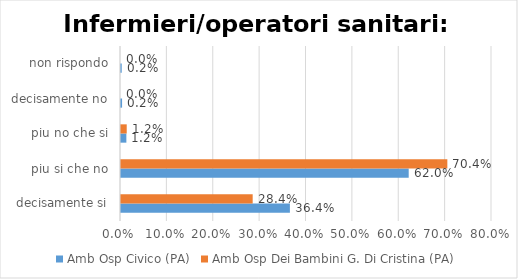
| Category | Amb Osp Civico (PA) | Amb Osp Dei Bambini G. Di Cristina (PA) |
|---|---|---|
| decisamente si | 0.364 | 0.284 |
| piu si che no | 0.62 | 0.704 |
| piu no che si | 0.012 | 0.012 |
| decisamente no | 0.002 | 0 |
| non rispondo | 0.002 | 0 |